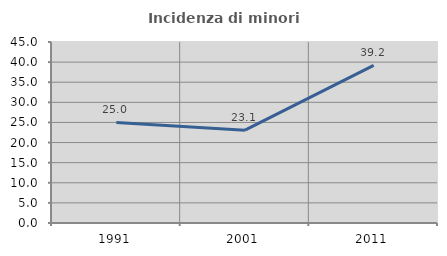
| Category | Incidenza di minori stranieri |
|---|---|
| 1991.0 | 25 |
| 2001.0 | 23.077 |
| 2011.0 | 39.189 |